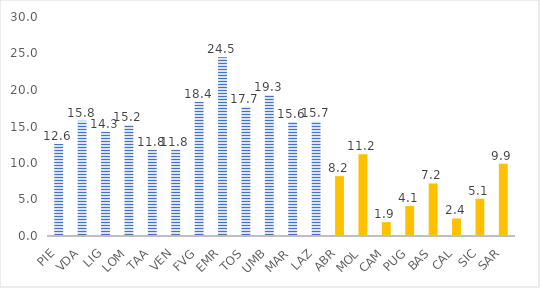
| Category | nidi e sezioni primavera |
|---|---|
| PIE | 12.6 |
| VDA | 15.8 |
| LIG | 14.3 |
| LOM | 15.2 |
| TAA | 11.8 |
| VEN | 11.8 |
| FVG | 18.4 |
| EMR | 24.5 |
| TOS | 17.7 |
| UMB | 19.3 |
| MAR | 15.6 |
| LAZ | 15.7 |
| ABR | 8.2 |
| MOL | 11.2 |
| CAM | 1.9 |
| PUG | 4.1 |
| BAS | 7.2 |
| CAL | 2.4 |
| SIC | 5.1 |
| SAR | 9.9 |